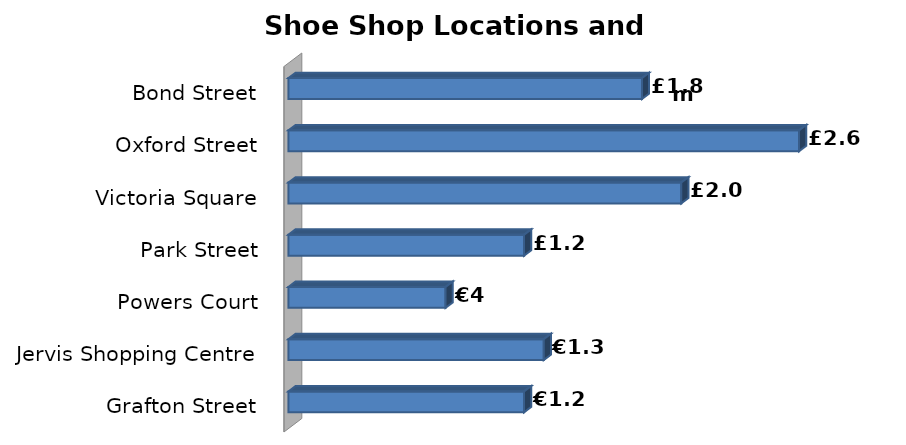
| Category | Sales  |
|---|---|
| Grafton Street | 1.2 |
| Jervis Shopping Centre | 1.3 |
| Powers Court | 0.8 |
| Park Street | 1.2 |
| Victoria Square | 2 |
| Oxford Street | 2.6 |
| Bond Street | 1.8 |